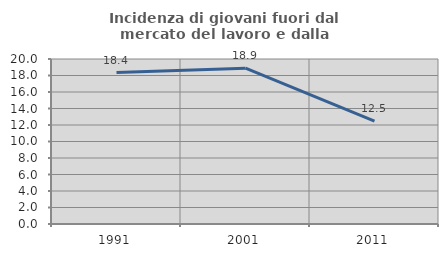
| Category | Incidenza di giovani fuori dal mercato del lavoro e dalla formazione  |
|---|---|
| 1991.0 | 18.353 |
| 2001.0 | 18.89 |
| 2011.0 | 12.479 |